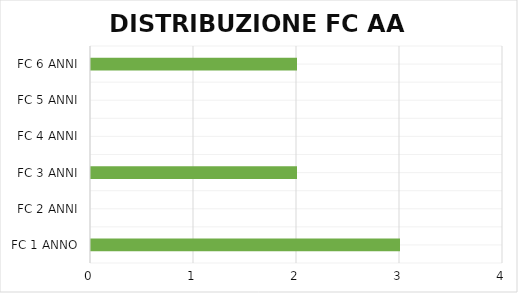
| Category | Series 0 |
|---|---|
| FC 1 ANNO | 3 |
| FC 2 ANNI | 0 |
| FC 3 ANNI | 2 |
| FC 4 ANNI | 0 |
| FC 5 ANNI | 0 |
| FC 6 ANNI | 2 |